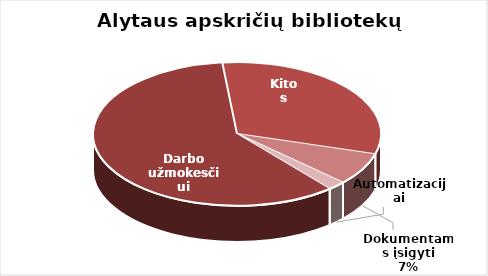
| Category | Series 0 |
|---|---|
| Darbo užmokesčiui | 1227186.22 |
| Kitos | 643527.79 |
| Dokumentams įsigyti | 150268.58 |
| Automatizacijai | 42303.37 |